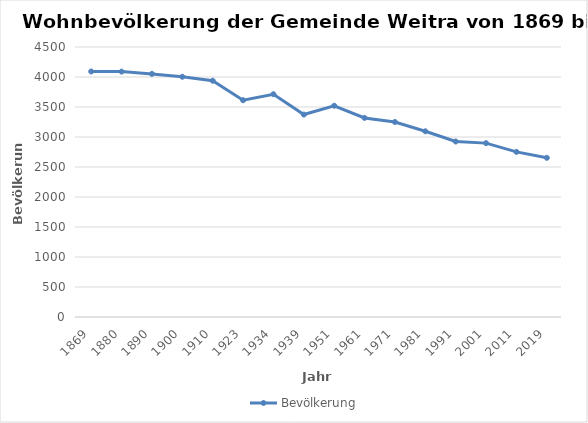
| Category | Bevölkerung |
|---|---|
| 1869.0 | 4092 |
| 1880.0 | 4090 |
| 1890.0 | 4052 |
| 1900.0 | 4004 |
| 1910.0 | 3938 |
| 1923.0 | 3613 |
| 1934.0 | 3713 |
| 1939.0 | 3374 |
| 1951.0 | 3521 |
| 1961.0 | 3318 |
| 1971.0 | 3250 |
| 1981.0 | 3095 |
| 1991.0 | 2925 |
| 2001.0 | 2898 |
| 2011.0 | 2752 |
| 2019.0 | 2653 |